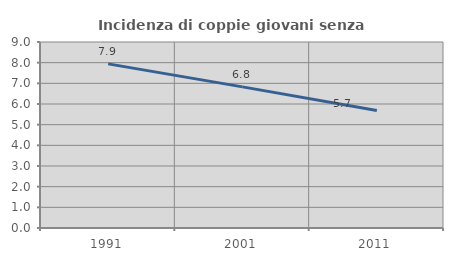
| Category | Incidenza di coppie giovani senza figli |
|---|---|
| 1991.0 | 7.942 |
| 2001.0 | 6.829 |
| 2011.0 | 5.684 |